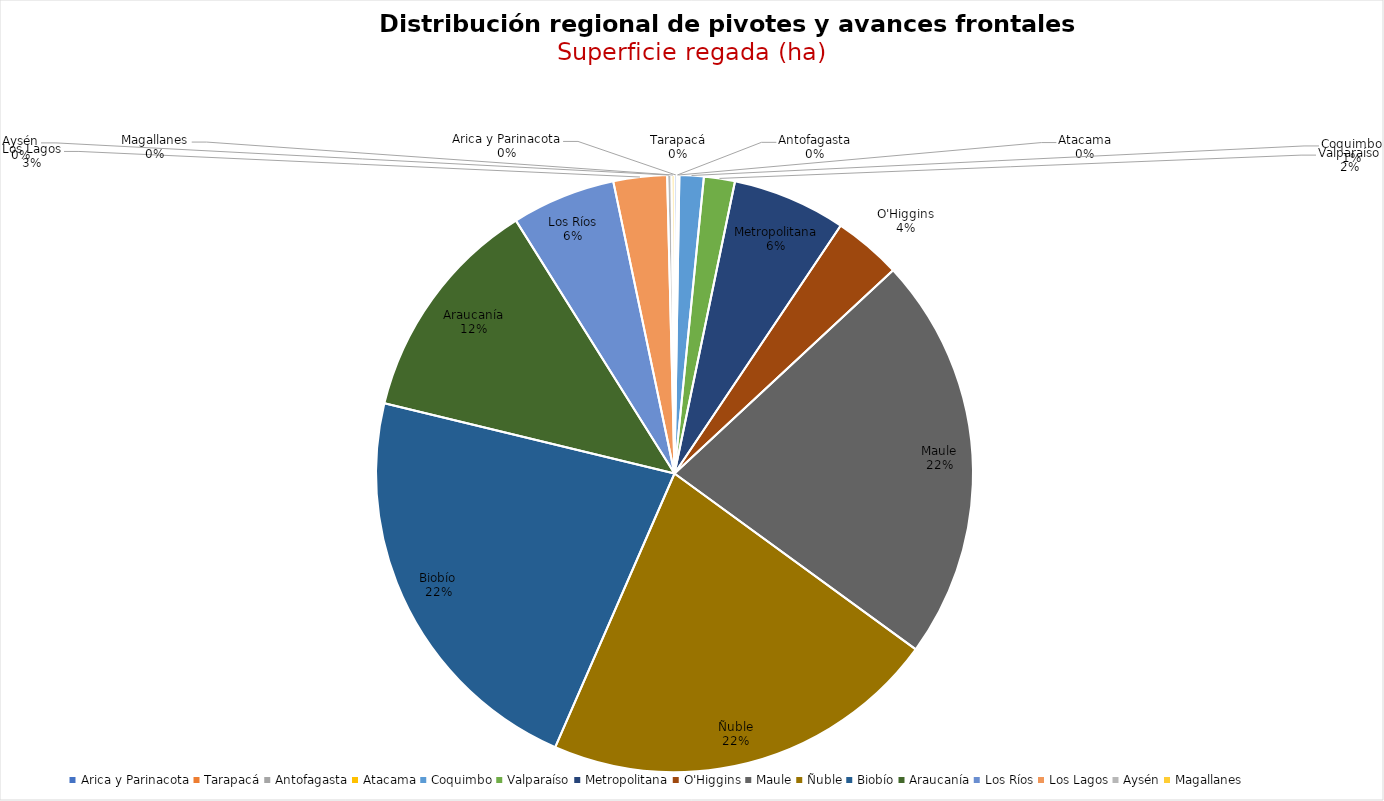
| Category | Superficie (ha) |
|---|---|
| Arica y Parinacota | 138 |
| Tarapacá | 0 |
| Antofagasta | 0 |
| Atacama | 100 |
| Coquimbo | 1228 |
| Valparaíso | 1567 |
| Metropolitana | 5747 |
| O'Higgins | 3439 |
| Maule | 20509 |
| Ñuble | 20110 |
| Biobío | 20782 |
| Araucanía | 11504 |
| Los Ríos | 5255 |
| Los Lagos | 2707 |
| Aysén | 220 |
| Magallanes | 153 |